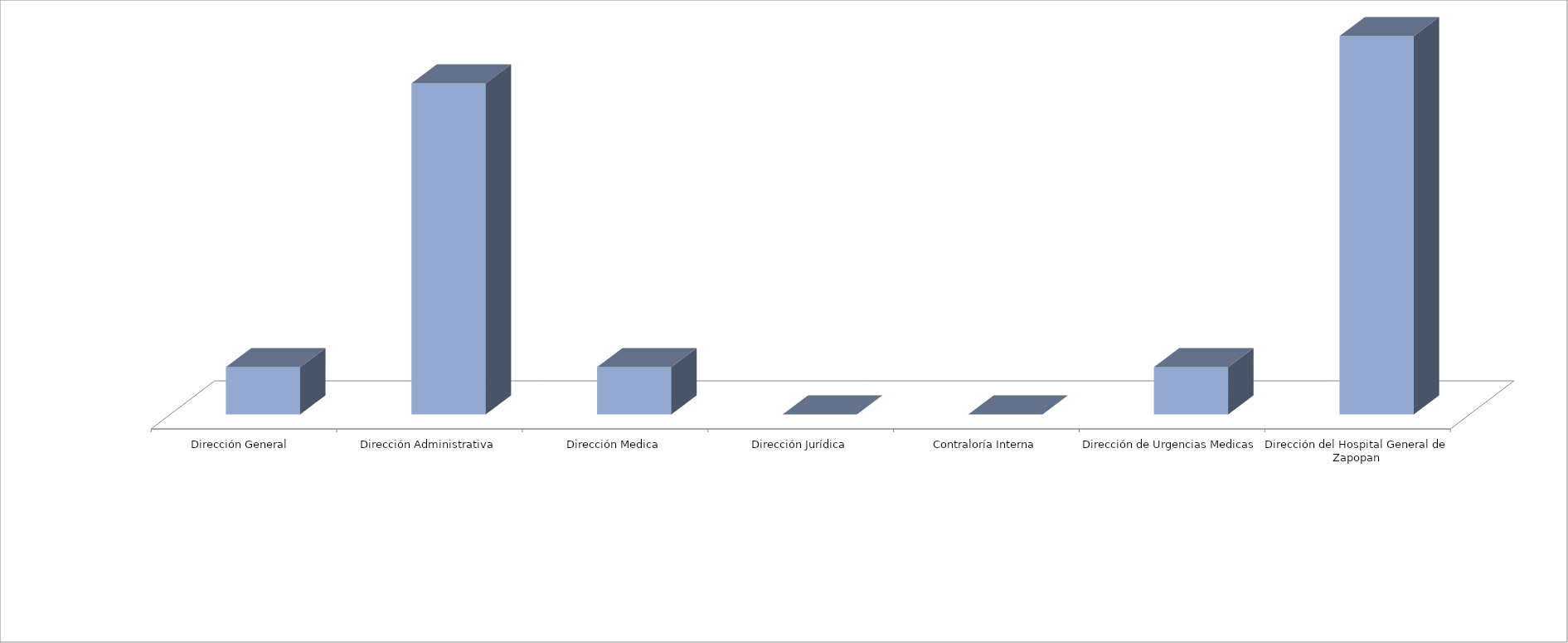
| Category | Series 0 | Series 1 |
|---|---|---|
| Dirección General  |  | 1 |
| Dirección Administrativa |  | 7 |
| Dirección Medica |  | 1 |
| Dirección Jurídica |  | 0 |
| Contraloría Interna |  | 0 |
| Dirección de Urgencias Medicas |  | 1 |
| Dirección del Hospital General de Zapopan |  | 8 |